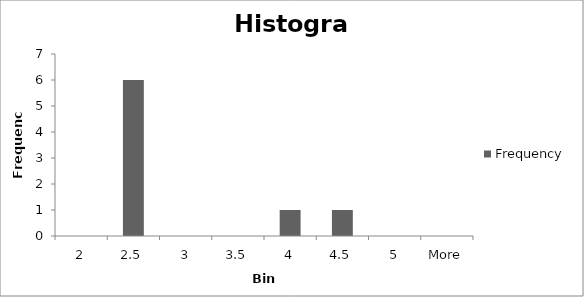
| Category | Frequency |
|---|---|
| 2 | 0 |
| 2.5 | 6 |
| 3 | 0 |
| 3.5 | 0 |
| 4 | 1 |
| 4.5 | 1 |
| 5 | 0 |
| More | 0 |